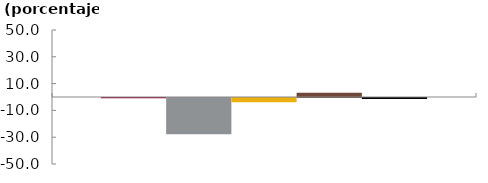
| Category | Bancos | CF | CFC | Coop | Sistema |
|---|---|---|---|---|---|
|  | -0.104 | -27.1 | -3.134 | 3.173 | -0.785 |